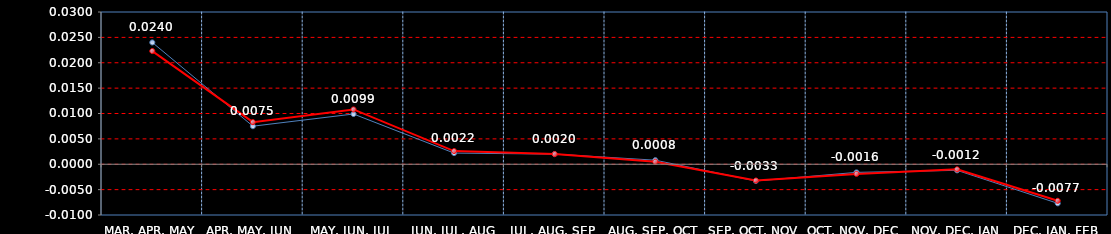
| Category | Last | Settlement |
|---|---|---|
| MAR, APR, MAY | 0.024 | 0.022 |
| APR, MAY, JUN | 0.008 | 0.008 |
| MAY, JUN, JUL | 0.01 | 0.011 |
| JUN, JUL, AUG | 0.002 | 0.003 |
| JUL, AUG, SEP | 0.002 | 0.002 |
| AUG, SEP, OCT | 0.001 | 0 |
| SEP, OCT, NOV | -0.003 | -0.003 |
| OCT, NOV, DEC | -0.002 | -0.002 |
| NOV, DEC, JAN | -0.001 | -0.001 |
| DEC, JAN, FEB | -0.008 | -0.007 |